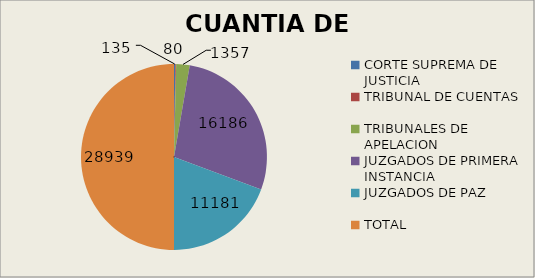
| Category | CUANTIA DE RESOLUCIONES |
|---|---|
| CORTE SUPREMA DE JUSTICIA | 135 |
| TRIBUNAL DE CUENTAS | 80 |
| TRIBUNALES DE APELACION | 1357 |
| JUZGADOS DE PRIMERA INSTANCIA | 16186 |
| JUZGADOS DE PAZ | 11181 |
| TOTAL | 28939 |